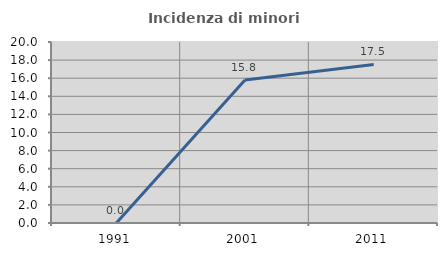
| Category | Incidenza di minori stranieri |
|---|---|
| 1991.0 | 0 |
| 2001.0 | 15.789 |
| 2011.0 | 17.526 |